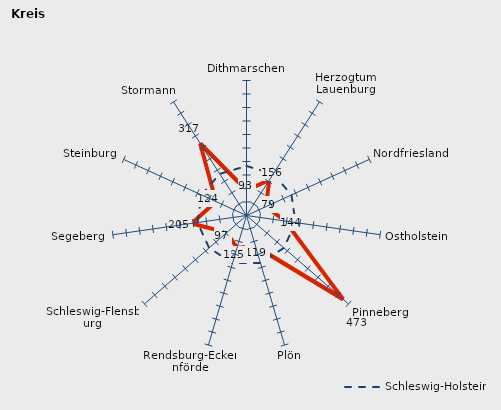
| Category | Kreise | Schleswig-Holstein |
|---|---|---|
| Dithmarschen | 93.273 | 183.286 |
| Herzogtum Lauenburg | 156.179 | 183.286 |
| Nordfriesland | 79.435 | 183.286 |
| Ostholstein | 143.99 | 183.286 |
| Pinneberg | 473.299 | 183.286 |
| Plön | 118.726 | 183.286 |
| Rendsburg-Eckernförde | 124.567 | 183.286 |
| Schleswig-Flensburg | 96.571 | 183.286 |
| Segeberg | 205.31 | 183.286 |
| Steinburg | 124.417 | 183.286 |
| Stormann | 317.4 | 183.286 |